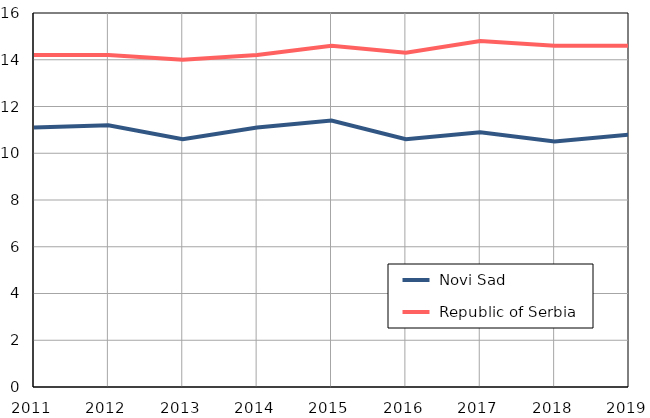
| Category |  Novi Sad |  Republic of Serbia |
|---|---|---|
| 2011.0 | 11.1 | 14.2 |
| 2012.0 | 11.2 | 14.2 |
| 2013.0 | 10.6 | 14 |
| 2014.0 | 11.1 | 14.2 |
| 2015.0 | 11.4 | 14.6 |
| 2016.0 | 10.6 | 14.3 |
| 2017.0 | 10.9 | 14.8 |
| 2018.0 | 10.5 | 14.6 |
| 2019.0 | 10.8 | 14.6 |